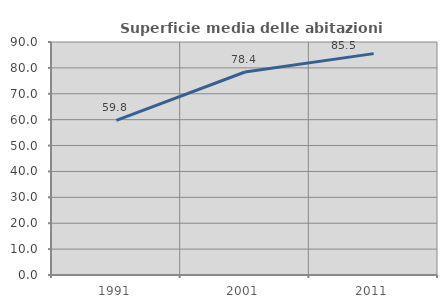
| Category | Superficie media delle abitazioni occupate |
|---|---|
| 1991.0 | 59.759 |
| 2001.0 | 78.413 |
| 2011.0 | 85.51 |